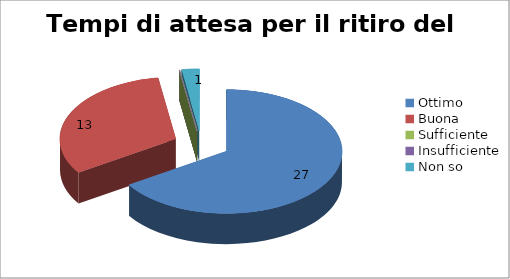
| Category | Tempi di attesa per il ritiro del referto |
|---|---|
| Ottimo | 27 |
| Buona | 13 |
| Sufficiente | 0 |
| Insufficiente | 0 |
| Non so | 1 |